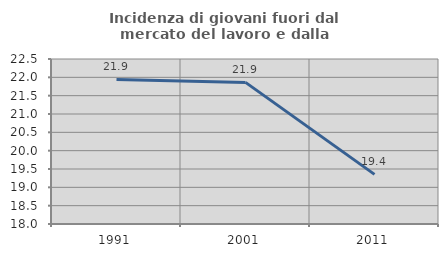
| Category | Incidenza di giovani fuori dal mercato del lavoro e dalla formazione  |
|---|---|
| 1991.0 | 21.944 |
| 2001.0 | 21.862 |
| 2011.0 | 19.353 |